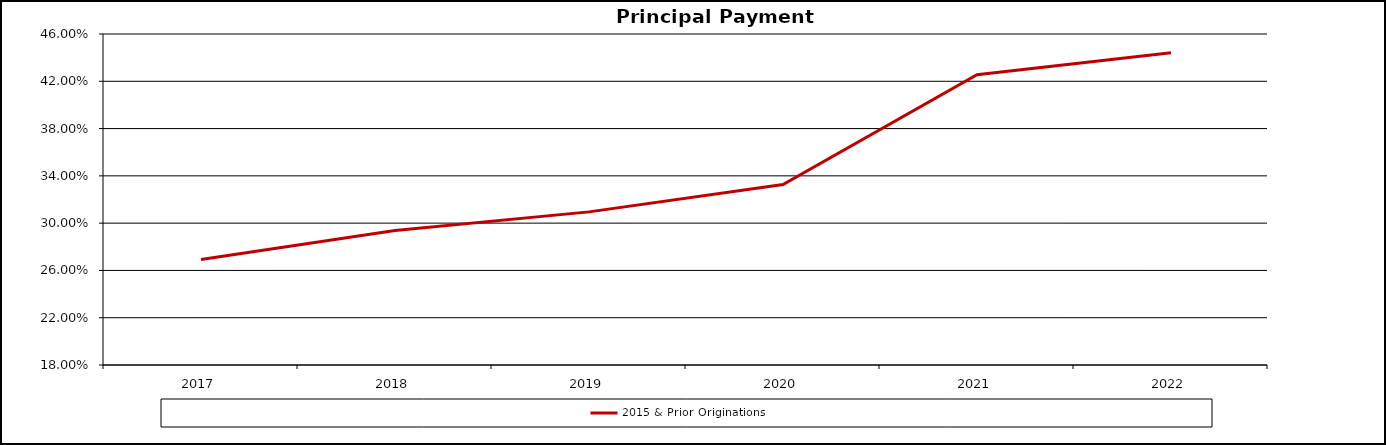
| Category | 2015 & Prior Originations |
|---|---|
| 2017.0 | 0.269 |
| 2018.0 | 0.294 |
| 2019.0 | 0.31 |
| 2020.0 | 0.333 |
| 2021.0 | 0.426 |
| 2022.0 | 0.444 |